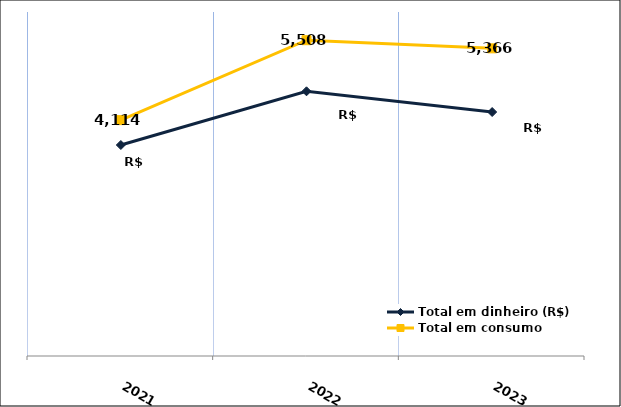
| Category | Total em dinheiro (R$) |
|---|---|
| 2021.0 | 3680.01 |
| 2022.0 | 4617.08 |
| 2023.0 | 4255.33 |